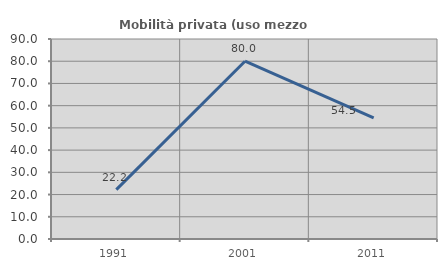
| Category | Mobilità privata (uso mezzo privato) |
|---|---|
| 1991.0 | 22.222 |
| 2001.0 | 80 |
| 2011.0 | 54.545 |